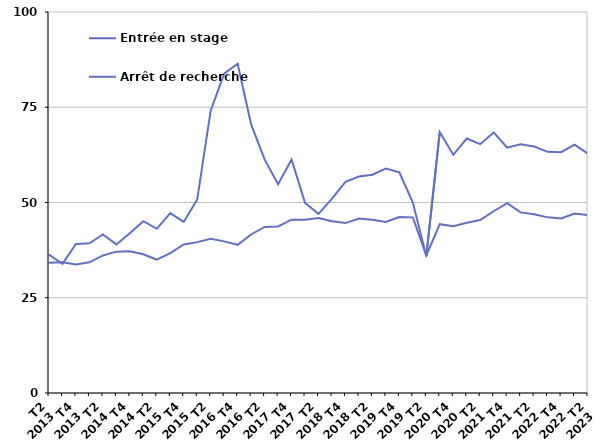
| Category | Entrée en stage | Arrêt de recherche |
|---|---|---|
| T2
2013 | 36.3 | 34.2 |
| T3
2013 | 33.9 | 34.3 |
| T4
2013 | 39.1 | 33.7 |
| T1
2014 | 39.3 | 34.3 |
| T2
2014 | 41.6 | 36.1 |
| T3
2014 | 39 | 37.1 |
| T4
2014 | 41.9 | 37.2 |
| T1
2015 | 45.1 | 36.4 |
| T2
2015 | 43.1 | 35 |
| T3
2015 | 47.2 | 36.7 |
| T4
2015 | 44.9 | 39 |
| T1
2016 | 50.8 | 39.6 |
| T2
2016 | 74.1 | 40.5 |
| T3
2016 | 83.8 | 39.8 |
| T4
2016 | 86.4 | 38.9 |
| T1
2017 | 70.5 | 41.6 |
| T2
2017 | 61.3 | 43.6 |
| T3
2017 | 54.8 | 43.7 |
| T4
2017 | 61.3 | 45.5 |
| T1
2018 | 49.9 | 45.5 |
| T2
2018 | 47 | 45.9 |
| T3
2018 | 51 | 45.1 |
| T4
2018 | 55.4 | 44.6 |
| T1
2019 | 56.8 | 45.8 |
| T2
2019 | 57.3 | 45.5 |
| T3
2019 | 58.9 | 44.9 |
| T4
2019 | 57.9 | 46.2 |
| T1
2020 | 50 | 46.1 |
| T2
2020 | 35.9 | 36.1 |
| T3
2020 | 68.5 | 44.3 |
| T4
2020 | 62.5 | 43.8 |
| T1
2021 | 66.8 | 44.7 |
| T2
2021 | 65.3 | 45.4 |
| T3
2021 | 68.4 | 47.7 |
| T4
2021 | 64.4 | 49.8 |
| T1
2022 | 65.3 | 47.4 |
| T2
2022 | 64.7 | 46.9 |
| T3
2022 | 63.3 | 46.1 |
| T4
2022 | 63.2 | 45.8 |
| T1
2023 | 65.2 | 47.1 |
| T2
2023 | 62.8 | 46.7 |